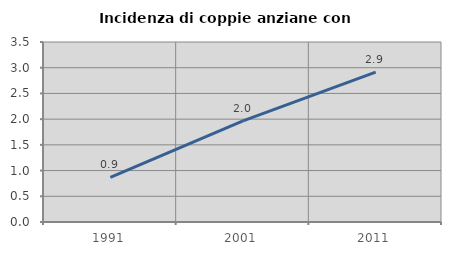
| Category | Incidenza di coppie anziane con figli |
|---|---|
| 1991.0 | 0.868 |
| 2001.0 | 1.965 |
| 2011.0 | 2.913 |